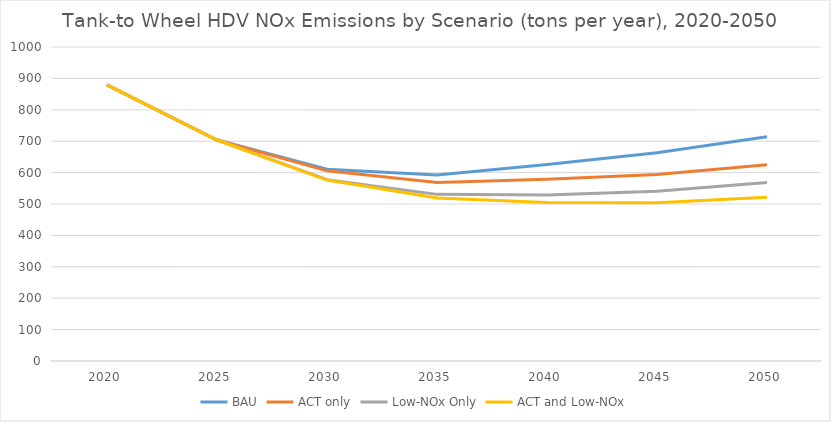
| Category | BAU | ACT only | Low-NOx Only | ACT and Low-NOx |
|---|---|---|---|---|
| 2020.0 | 879.221 | 879.221 | 879.221 | 879.221 |
| 2025.0 | 703.837 | 703.837 | 703.837 | 703.837 |
| 2030.0 | 610.458 | 605.667 | 577.619 | 576.315 |
| 2035.0 | 592.09 | 568.479 | 530.667 | 519.412 |
| 2040.0 | 625.612 | 578.449 | 528.997 | 505.04 |
| 2045.0 | 663.483 | 594.047 | 540.229 | 503.901 |
| 2050.0 | 714.424 | 625.35 | 568.232 | 521.117 |